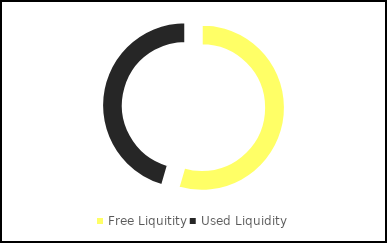
| Category | Series 0 |
|---|---|
| Free Liquitity | 545 |
| Used Liquidity | 455 |